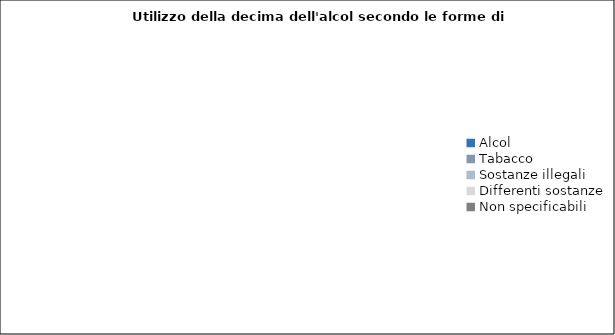
| Category | Series 0 |
|---|---|
| Alcol | 0 |
| Tabacco | 0 |
| Sostanze illegali | 0 |
| Differenti sostanze | 0 |
| Non specificabili | 0 |